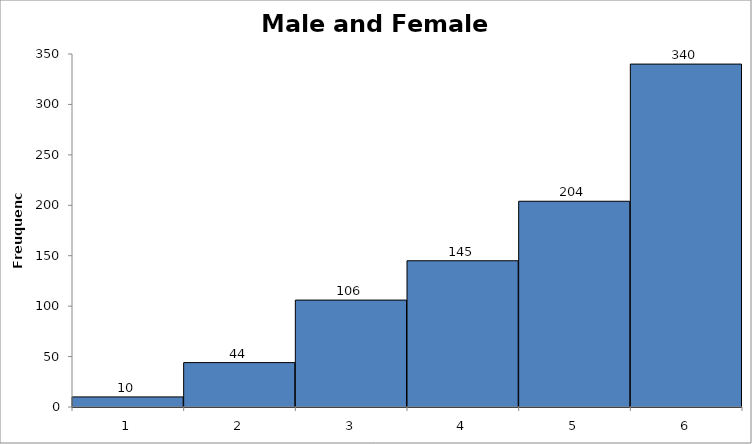
| Category | Series 1 |
|---|---|
| 0 | 10 |
| 1 | 44 |
| 2 | 106 |
| 3 | 145 |
| 4 | 204 |
| 5 | 340 |